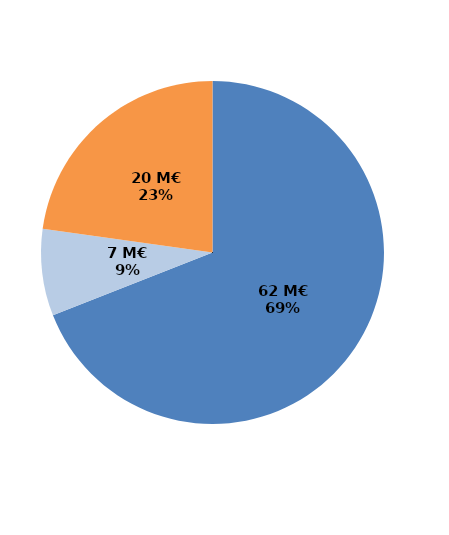
| Category | Series 0 |
|---|---|
| Formations certifiantes et pré-certifiantes | 61.672 |
| Formations professionnalisantes | 7.323 |
| Formations d'insertion sociale et professionnelle | 20.351 |